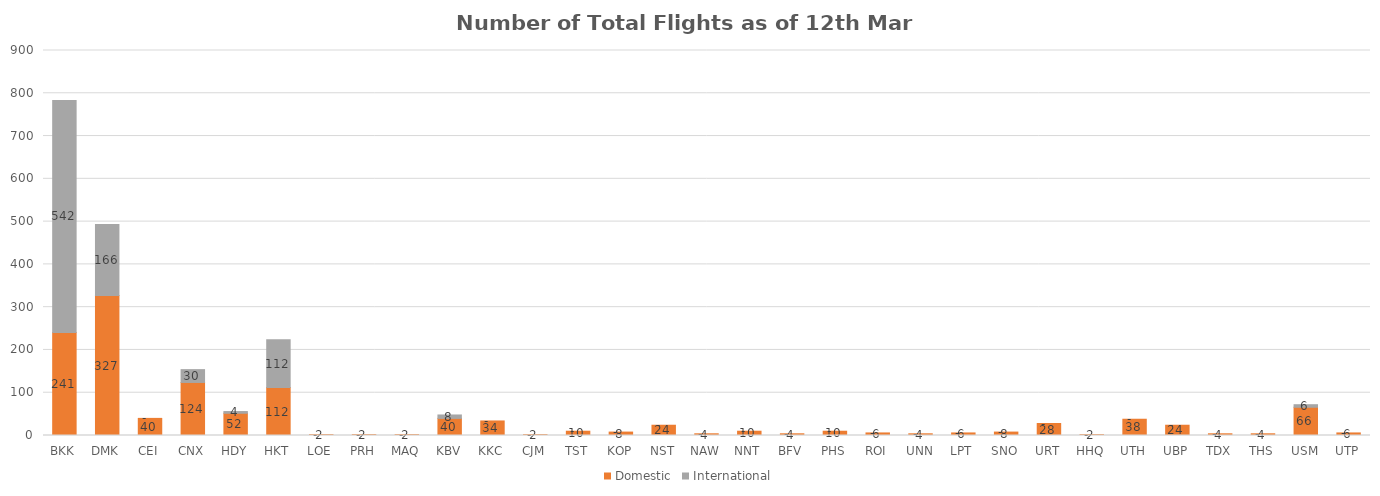
| Category | Domestic | International |
|---|---|---|
| BKK | 241 | 542 |
| DMK | 327 | 166 |
| CEI | 40 | 0 |
| CNX | 124 | 30 |
| HDY | 52 | 4 |
| HKT | 112 | 112 |
| LOE | 2 | 0 |
| PRH | 2 | 0 |
| MAQ | 2 | 0 |
| KBV | 40 | 8 |
| KKC | 34 | 0 |
| CJM | 2 | 0 |
| TST | 10 | 0 |
| KOP | 8 | 0 |
| NST | 24 | 0 |
| NAW | 4 | 0 |
| NNT | 10 | 0 |
| BFV | 4 | 0 |
| PHS | 10 | 0 |
| ROI | 6 | 0 |
| UNN | 4 | 0 |
| LPT | 6 | 0 |
| SNO | 8 | 0 |
| URT | 28 | 0 |
| HHQ | 2 | 0 |
| UTH | 38 | 0 |
| UBP | 24 | 0 |
| TDX | 4 | 0 |
| THS | 4 | 0 |
| USM | 66 | 6 |
| UTP | 6 | 0 |